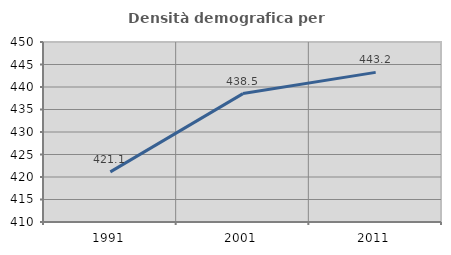
| Category | Densità demografica |
|---|---|
| 1991.0 | 421.133 |
| 2001.0 | 438.534 |
| 2011.0 | 443.247 |